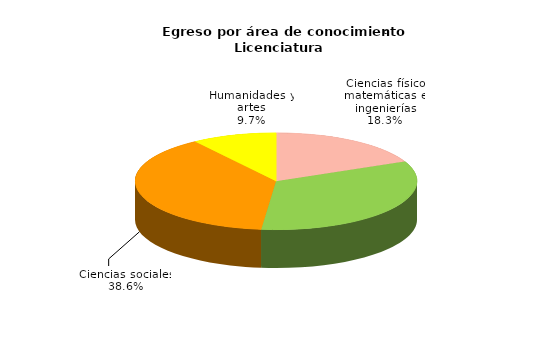
| Category | Series 0 |
|---|---|
| Ciencias físico matemáticas e ingenierías | 5886 |
| Ciencias biológicas, químicas y de la salud | 10712 |
| Ciencias sociales | 12412 |
| Humanidades y artes | 3116 |